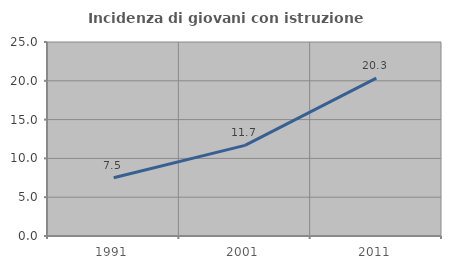
| Category | Incidenza di giovani con istruzione universitaria |
|---|---|
| 1991.0 | 7.5 |
| 2001.0 | 11.682 |
| 2011.0 | 20.349 |